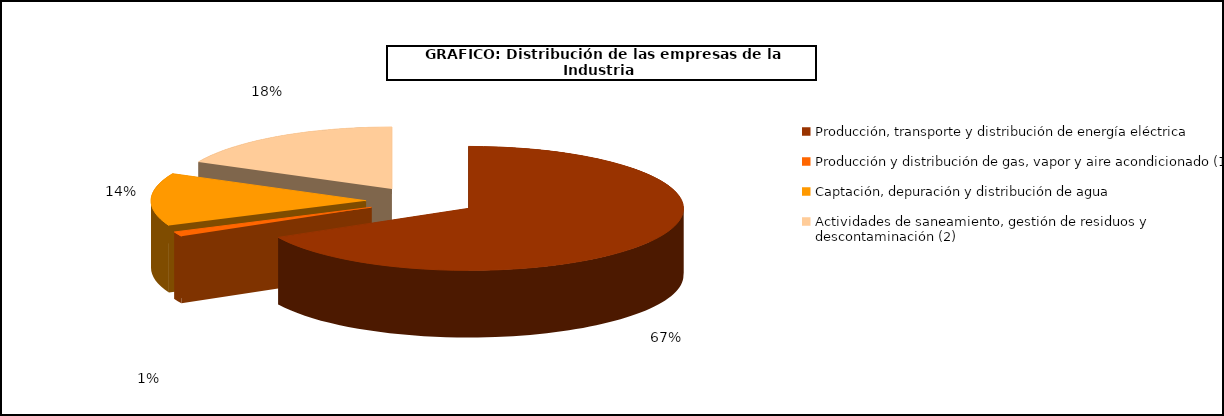
| Category | Series 0 |
|---|---|
| Producción, transporte y distribución de energía eléctrica | 14294 |
| Producción y distribución de gas, vapor y aire acondicionado (1) | 257 |
| Captación, depuración y distribución de agua | 2919 |
| Actividades de saneamiento, gestión de residuos y descontaminación (2) | 3785 |